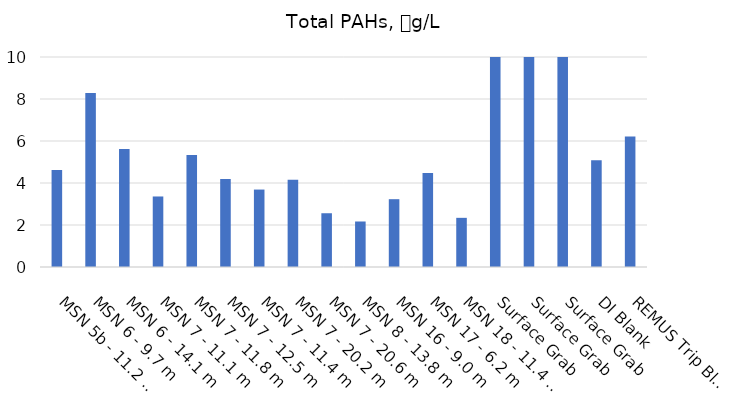
| Category | Total PAHs |
|---|---|
| MSN 5b - 11.2 m | 4.614 |
| MSN 6 - 9.7 m | 8.285 |
| MSN 6 - 14.1 m | 5.622 |
| MSN 7 - 11.1 m | 3.358 |
| MSN 7 - 11.8 m | 5.333 |
| MSN 7 - 12.5 m | 4.191 |
| MSN 7 - 11.4 m | 3.688 |
| MSN 7 - 20.2 m | 4.154 |
| MSN 7 - 20.6 m | 2.56 |
| MSN 8 - 13.8 m | 2.167 |
| MSN 16 - 9.0 m | 3.229 |
| MSN 17 - 6.2 m | 4.475 |
| MSN 18 - 11.4 m | 2.341 |
| Surface Grab | 3079.707 |
| Surface Grab | 69.004 |
| Surface Grab | 3454.434 |
| DI Blank | 5.084 |
| REMUS Trip Blank | 6.218 |